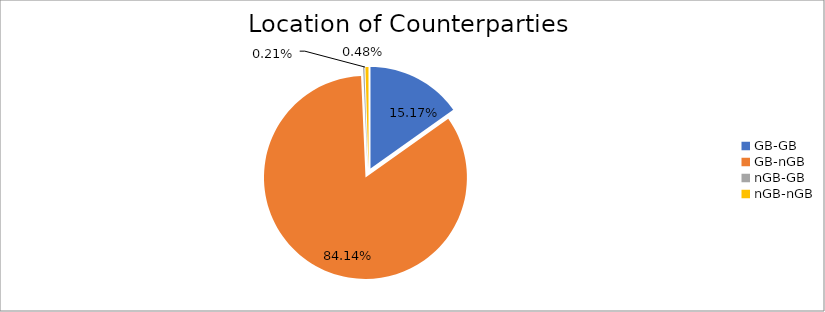
| Category | Series 0 |
|---|---|
| GB-GB | 1396033.451 |
| GB-nGB | 7743660.865 |
| nGB-GB | 19486.03 |
| nGB-nGB | 44577.151 |